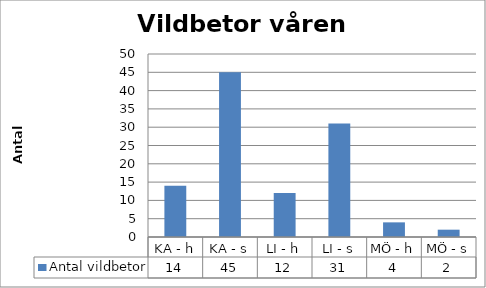
| Category | Antal vildbetor |
|---|---|
| KA - h | 14 |
| KA - s | 45 |
| LI - h | 12 |
| LI - s | 31 |
| MÖ - h | 4 |
| MÖ - s | 2 |